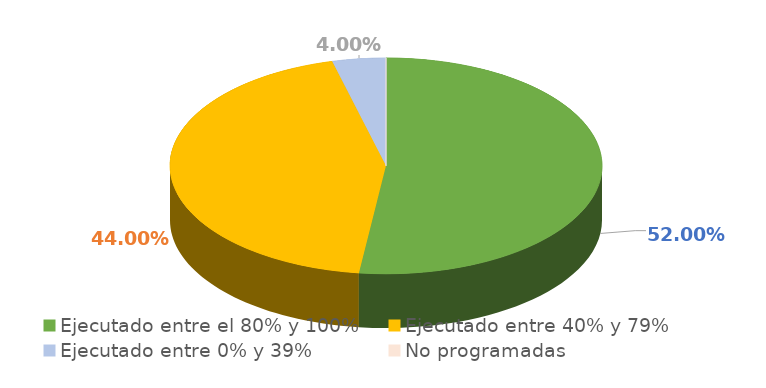
| Category | Series 0 |
|---|---|
| Ejecutado entre el 80% y 100% | 0.52 |
| Ejecutado entre 40% y 79% | 0.44 |
| Ejecutado entre 0% y 39% | 0.04 |
| No programadas | 0 |